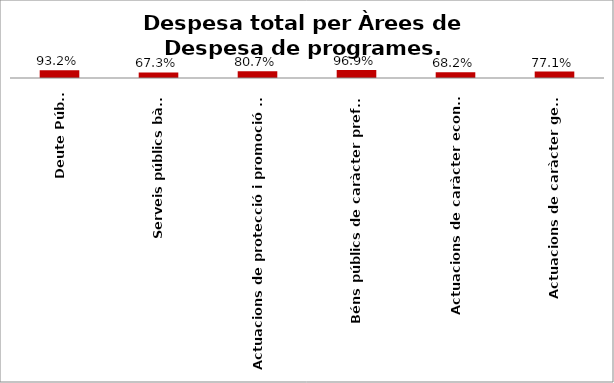
| Category | Series 0 |
|---|---|
| Deute Públic | 0.932 |
| Serveis públics bàsics | 0.673 |
| Actuacions de protecció i promoció social | 0.807 |
| Béns públics de caràcter preferent | 0.969 |
| Actuacions de caràcter econòmic | 0.682 |
| Actuacions de caràcter general | 0.771 |